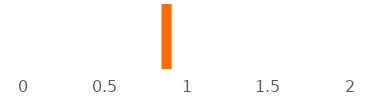
| Category | Top Conditions Opioids are Most Prescribed For | Condition |
|---|---|---|
| 0 |  | 0 |